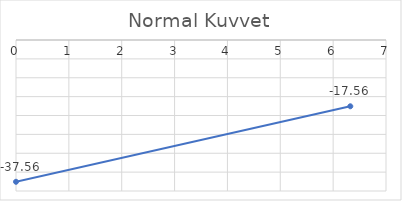
| Category | Series 0 |
|---|---|
| 0.0 | -37.558 |
| 6.324555320336759 | -17.558 |